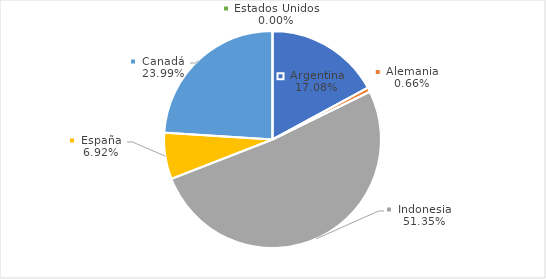
| Category | Series 0 |
|---|---|
| Argentina | 332.471 |
| Alemania | 12.813 |
| Indonesia | 999.427 |
| España | 134.741 |
| Canadá | 466.983 |
| Estados Unidos | 0.012 |